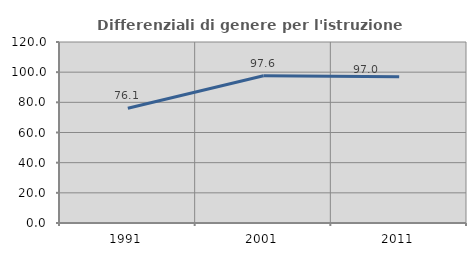
| Category | Differenziali di genere per l'istruzione superiore |
|---|---|
| 1991.0 | 76.066 |
| 2001.0 | 97.62 |
| 2011.0 | 97.007 |